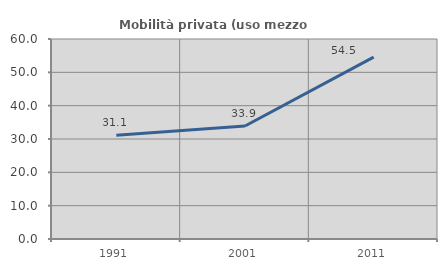
| Category | Mobilità privata (uso mezzo privato) |
|---|---|
| 1991.0 | 31.1 |
| 2001.0 | 33.895 |
| 2011.0 | 54.545 |